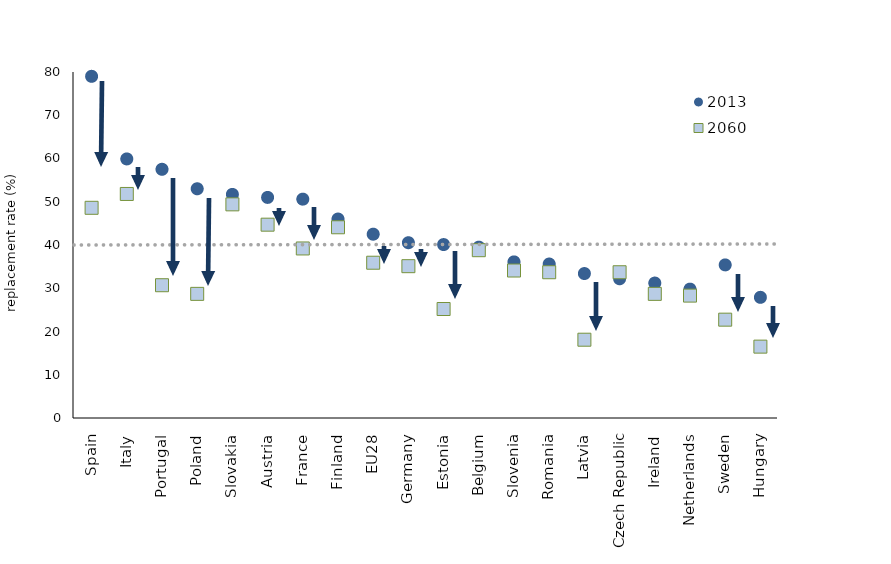
| Category | 2013 | 2060 |
|---|---|---|
| Spain | 79 | 48.6 |
| Italy | 59.9 | 51.8 |
| Portugal | 57.5 | 30.7 |
| Poland | 53 | 28.7 |
| Slovakia | 51.7 | 49.4 |
| Austria | 51 | 44.7 |
| France | 50.6 | 39.2 |
| Finland | 46 | 44.1 |
| EU28 | 42.5 | 35.9 |
| Germany | 40.528 | 35.102 |
| Estonia | 40.1 | 25.2 |
| Belgium | 39.5 | 38.8 |
| Slovenia | 36.1 | 34.1 |
| Romania | 35.6 | 33.7 |
| Latvia | 33.4 | 18.1 |
| Czech Republic | 32.2 | 33.7 |
| Ireland | 31.2 | 28.7 |
| Netherlands | 29.8 | 28.3 |
| Sweden | 35.397 | 22.737 |
| Hungary | 27.9 | 16.5 |